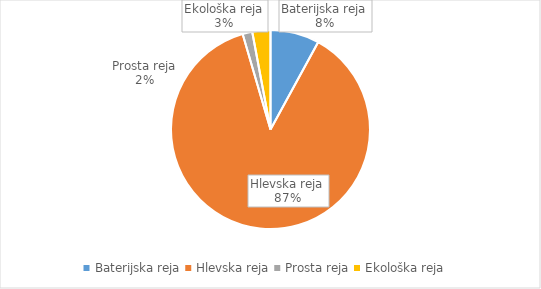
| Category | Količina kosov jajc |
|---|---|
| Baterijska reja | 247491 |
| Hlevska reja | 2725321 |
| Prosta reja | 49053 |
| Ekološka reja | 91690 |